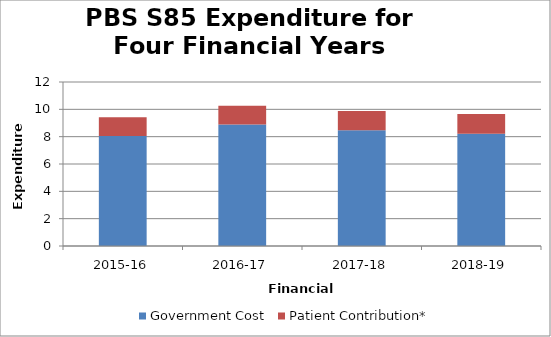
| Category | Government Cost | Patient Contribution* |
|---|---|---|
| 2015-16 | 8055467620.37 | 1363172787.65 |
| 2016-17 | 8890219372.85 | 1366210056.28 |
| 2017-18 | 8463949539.89 | 1415421728.05 |
| 2018-19 | 8211647712 | 1440022614.92 |